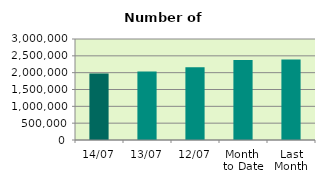
| Category | Series 0 |
|---|---|
| 14/07 | 1977304 |
| 13/07 | 2033554 |
| 12/07 | 2163504 |
| Month 
to Date | 2373286 |
| Last
Month | 2394428.455 |